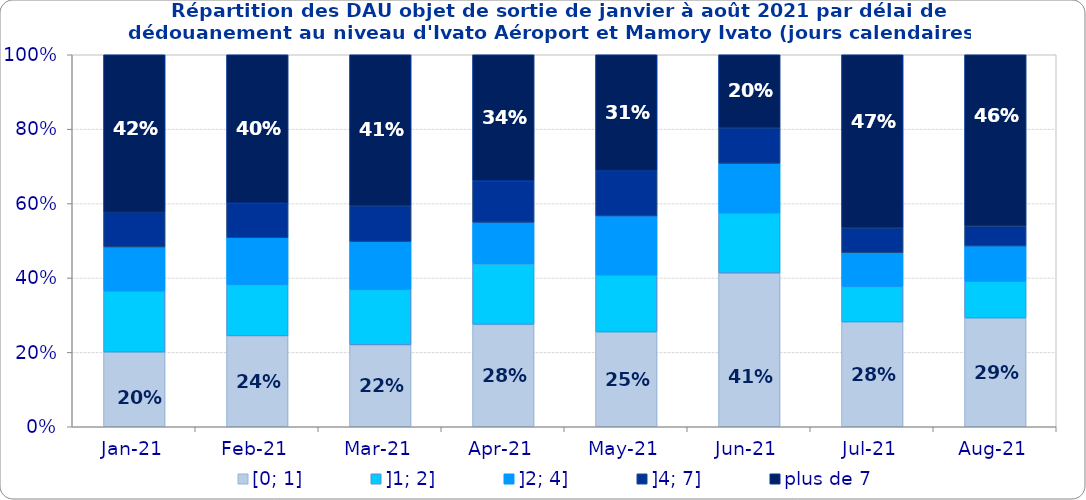
| Category | [0; 1] | ]1; 2] | ]2; 4] | ]4; 7] | plus de 7 |
|---|---|---|---|---|---|
| 2021-01-01 | 0.201 | 0.164 | 0.118 | 0.093 | 0.423 |
| 2021-02-01 | 0.244 | 0.138 | 0.126 | 0.093 | 0.399 |
| 2021-03-01 | 0.22 | 0.149 | 0.128 | 0.097 | 0.406 |
| 2021-04-01 | 0.275 | 0.163 | 0.112 | 0.112 | 0.339 |
| 2021-05-01 | 0.255 | 0.153 | 0.159 | 0.122 | 0.311 |
| 2021-06-01 | 0.413 | 0.161 | 0.133 | 0.096 | 0.196 |
| 2021-07-01 | 0.282 | 0.095 | 0.09 | 0.067 | 0.465 |
| 2021-08-01 | 0.292 | 0.099 | 0.095 | 0.054 | 0.46 |